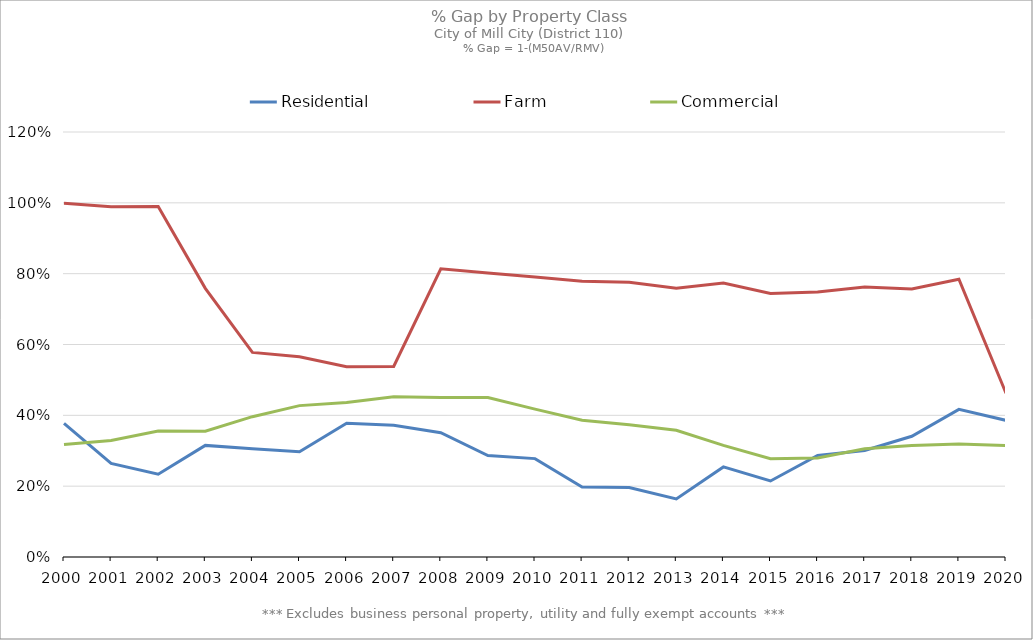
| Category | Residential | Farm | Commercial |
|---|---|---|---|
| 2000.0 | 0.378 | 0.999 | 0.318 |
| 2001.0 | 0.264 | 0.989 | 0.329 |
| 2002.0 | 0.234 | 0.989 | 0.355 |
| 2003.0 | 0.315 | 0.759 | 0.355 |
| 2004.0 | 0.306 | 0.578 | 0.396 |
| 2005.0 | 0.297 | 0.566 | 0.427 |
| 2006.0 | 0.378 | 0.537 | 0.437 |
| 2007.0 | 0.372 | 0.538 | 0.452 |
| 2008.0 | 0.351 | 0.814 | 0.45 |
| 2009.0 | 0.286 | 0.802 | 0.45 |
| 2010.0 | 0.278 | 0.791 | 0.418 |
| 2011.0 | 0.197 | 0.779 | 0.386 |
| 2012.0 | 0.196 | 0.776 | 0.373 |
| 2013.0 | 0.164 | 0.759 | 0.358 |
| 2014.0 | 0.254 | 0.774 | 0.315 |
| 2015.0 | 0.215 | 0.744 | 0.277 |
| 2016.0 | 0.287 | 0.749 | 0.279 |
| 2017.0 | 0.301 | 0.762 | 0.306 |
| 2018.0 | 0.341 | 0.757 | 0.315 |
| 2019.0 | 0.417 | 0.784 | 0.319 |
| 2020.0 | 0.386 | 0.462 | 0.314 |